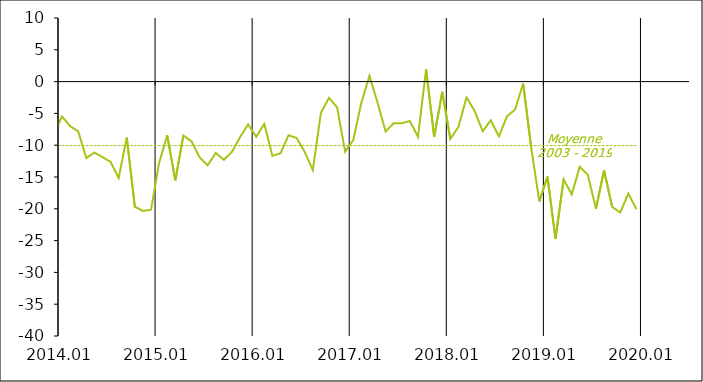
| Category | Series 1 | Moyenne
2003 - 2019 |
|---|---|---|
| 2003-01-20 | 0 | -10.06 |
| 2003-02-20 | -6 | -10.06 |
| 2003-03-20 | -10 | -10.06 |
| 2003-04-20 | 0 | -10.06 |
| 2003-05-20 | -2 | -10.06 |
| 2003-06-20 | -1 | -10.06 |
| 2003-07-20 | -4 | -10.06 |
| 2003-08-20 | 0 | -10.06 |
| 2003-09-20 | -2 | -10.06 |
| 2003-10-20 | -3 | -10.06 |
| 2003-11-20 | 2 | -10.06 |
| 2003-12-20 | -3 | -10.06 |
| 2004-01-20 | -7 | -10.06 |
| 2004-02-20 | -3 | -10.06 |
| 2004-03-20 | 1 | -10.06 |
| 2004-04-20 | -4 | -10.06 |
| 2004-05-20 | -1 | -10.06 |
| 2004-06-20 | -2 | -10.06 |
| 2004-07-20 | -5 | -10.06 |
| 2004-08-20 | 3 | -10.06 |
| 2004-09-20 | -3 | -10.06 |
| 2004-10-20 | 1 | -10.06 |
| 2004-11-20 | -6 | -10.06 |
| 2004-12-20 | -4 | -10.06 |
| 2005-01-20 | -3 | -10.06 |
| 2005-02-20 | 5 | -10.06 |
| 2005-03-20 | -5 | -10.06 |
| 2005-04-20 | -7 | -10.06 |
| 2005-05-20 | -8 | -10.06 |
| 2005-06-20 | -8 | -10.06 |
| 2005-07-20 | -4 | -10.06 |
| 2005-08-20 | -9 | -10.06 |
| 2005-09-20 | -7 | -10.06 |
| 2005-10-20 | -7 | -10.06 |
| 2005-11-20 | -9 | -10.06 |
| 2005-12-20 | -4 | -10.06 |
| 2006-01-20 | 1 | -10.06 |
| 2006-02-20 | -6 | -10.06 |
| 2006-03-20 | -3 | -10.06 |
| 2006-04-20 | -7 | -10.06 |
| 2006-05-20 | -9 | -10.06 |
| 2006-06-20 | -2 | -10.06 |
| 2006-07-20 | -1 | -10.06 |
| 2006-08-20 | -8 | -10.06 |
| 2006-09-20 | -13 | -10.06 |
| 2006-10-20 | -9 | -10.06 |
| 2006-11-20 | -5 | -10.06 |
| 2006-12-20 | -6 | -10.06 |
| 2007-01-20 | -7 | -10.06 |
| 2007-02-20 | -4 | -10.06 |
| 2007-03-20 | -4 | -10.06 |
| 2007-04-20 | -2 | -10.06 |
| 2007-05-20 | -3 | -10.06 |
| 2007-06-20 | -5 | -10.06 |
| 2007-07-20 | -8 | -10.06 |
| 2007-08-20 | -11 | -10.06 |
| 2007-09-20 | -4 | -10.06 |
| 2007-10-20 | -12 | -10.06 |
| 2007-11-20 | -12 | -10.06 |
| 2007-12-20 | -15 | -10.06 |
| 2008-01-20 | -20 | -10.06 |
| 2008-02-20 | -22 | -10.06 |
| 2008-03-20 | -16 | -10.06 |
| 2008-04-20 | -19 | -10.06 |
| 2008-05-20 | -16 | -10.06 |
| 2008-06-20 | -22 | -10.06 |
| 2008-07-20 | -20 | -10.06 |
| 2008-08-20 | -19 | -10.06 |
| 2008-09-20 | -15 | -10.06 |
| 2008-10-20 | -15 | -10.06 |
| 2008-11-20 | -17 | -10.06 |
| 2008-12-20 | -18 | -10.06 |
| 2009-01-20 | -17 | -10.06 |
| 2009-02-20 | -17 | -10.06 |
| 2009-03-20 | -20 | -10.06 |
| 2009-04-20 | -21 | -10.06 |
| 2009-05-20 | -22 | -10.06 |
| 2009-06-20 | -19 | -10.06 |
| 2009-07-20 | -15 | -10.06 |
| 2009-08-20 | -19 | -10.06 |
| 2009-09-20 | -14 | -10.06 |
| 2009-10-20 | -10 | -10.06 |
| 2009-11-20 | -16 | -10.06 |
| 2009-12-20 | -13 | -10.06 |
| 2010-01-20 | -8 | -10.06 |
| 2010-02-20 | -15 | -10.06 |
| 2010-03-20 | -15 | -10.06 |
| 2010-04-20 | -13 | -10.06 |
| 2010-05-20 | -14 | -10.06 |
| 2010-06-20 | -8 | -10.06 |
| 2010-07-20 | -13 | -10.06 |
| 2010-08-20 | -14 | -10.06 |
| 2010-09-20 | -12 | -10.06 |
| 2010-10-20 | -8 | -10.06 |
| 2010-11-20 | -7 | -10.06 |
| 2010-12-20 | -13 | -10.06 |
| 2011-01-20 | -15 | -10.06 |
| 2011-02-20 | -15 | -10.06 |
| 2011-03-20 | -18 | -10.06 |
| 2011-04-20 | -19 | -10.06 |
| 2011-05-20 | -13 | -10.06 |
| 2011-06-20 | -16 | -10.06 |
| 2011-07-20 | -17 | -10.06 |
| 2011-08-20 | -18 | -10.06 |
| 2011-09-20 | -8 | -10.06 |
| 2011-10-20 | -9 | -10.06 |
| 2011-11-20 | -8 | -10.06 |
| 2011-12-20 | -18 | -10.06 |
| 2012-01-20 | -16 | -10.06 |
| 2012-02-20 | -14 | -10.06 |
| 2012-03-20 | -12 | -10.06 |
| 2012-04-20 | -9 | -10.06 |
| 2012-05-20 | -8 | -10.06 |
| 2012-06-20 | -16 | -10.06 |
| 2012-07-20 | -8 | -10.06 |
| 2012-08-20 | -11 | -10.06 |
| 2012-09-20 | -11 | -10.06 |
| 2012-10-20 | -11 | -10.06 |
| 2012-11-20 | -15.069 | -10.06 |
| 2012-12-20 | -14.739 | -10.06 |
| 2013-01-20 | -14.22 | -10.06 |
| 2013-02-20 | -12.452 | -10.06 |
| 2013-03-20 | -11.836 | -10.06 |
| 2013-04-20 | -14.694 | -10.06 |
| 2013-05-20 | -17.673 | -10.06 |
| 2013-06-20 | -17.878 | -10.06 |
| 2013-07-20 | -11.597 | -10.06 |
| 2013-08-20 | -14.286 | -10.06 |
| 2013-09-20 | -7.624 | -10.06 |
| 2013-10-20 | -11.051 | -10.06 |
| 2013-11-20 | -7.118 | -10.06 |
| 2013-12-20 | -8.084 | -10.06 |
| 2014-01-20 | -5.489 | -10.06 |
| 2014-02-20 | -7.001 | -10.06 |
| 2014-03-20 | -7.84 | -10.06 |
| 2014-04-20 | -12.016 | -10.06 |
| 2014-05-20 | -11.157 | -10.06 |
| 2014-06-20 | -11.867 | -10.06 |
| 2014-07-20 | -12.639 | -10.06 |
| 2014-08-20 | -15.156 | -10.06 |
| 2014-09-20 | -8.8 | -10.06 |
| 2014-10-20 | -19.679 | -10.06 |
| 2014-11-20 | -20.338 | -10.06 |
| 2014-12-20 | -20.141 | -10.06 |
| 2015-01-20 | -12.784 | -10.06 |
| 2015-02-20 | -8.455 | -10.06 |
| 2015-03-20 | -15.527 | -10.06 |
| 2015-04-20 | -8.49 | -10.06 |
| 2015-05-20 | -9.381 | -10.06 |
| 2015-06-20 | -11.9 | -10.06 |
| 2015-07-20 | -13.16 | -10.06 |
| 2015-08-20 | -11.222 | -10.06 |
| 2015-09-20 | -12.293 | -10.06 |
| 2015-10-20 | -11.045 | -10.06 |
| 2015-11-20 | -8.736 | -10.06 |
| 2015-12-20 | -6.726 | -10.06 |
| 2016-01-20 | -8.67 | -10.06 |
| 2016-02-20 | -6.653 | -10.06 |
| 2016-03-20 | -11.663 | -10.06 |
| 2016-04-20 | -11.272 | -10.06 |
| 2016-05-20 | -8.432 | -10.06 |
| 2016-06-20 | -8.867 | -10.06 |
| 2016-07-20 | -11.078 | -10.06 |
| 2016-08-20 | -13.917 | -10.06 |
| 2016-09-20 | -4.904 | -10.06 |
| 2016-10-20 | -2.55 | -10.06 |
| 2016-11-20 | -4.062 | -10.06 |
| 2016-12-20 | -11.011 | -10.06 |
| 2017-01-20 | -9.177 | -10.06 |
| 2017-02-20 | -3.307 | -10.06 |
| 2017-03-20 | 0.905 | -10.06 |
| 2017-04-20 | -3.317 | -10.06 |
| 2017-05-20 | -7.84 | -10.06 |
| 2017-06-20 | -6.532 | -10.06 |
| 2017-07-20 | -6.538 | -10.06 |
| 2017-08-20 | -6.198 | -10.06 |
| 2017-09-20 | -8.674 | -10.06 |
| 2017-10-20 | 1.924 | -10.06 |
| 2017-11-20 | -8.669 | -10.06 |
| 2017-12-20 | -1.62 | -10.06 |
| 2018-01-20 | -8.999 | -10.06 |
| 2018-02-20 | -7.121 | -10.06 |
| 2018-03-20 | -2.491 | -10.06 |
| 2018-04-20 | -4.601 | -10.06 |
| 2018-05-20 | -7.808 | -10.06 |
| 2018-06-20 | -6.086 | -10.06 |
| 2018-07-20 | -8.618 | -10.06 |
| 2018-08-20 | -5.47 | -10.06 |
| 2018-09-20 | -4.396 | -10.06 |
| 2018-10-20 | -0.308 | -10.06 |
| 2018-11-20 | -10.44 | -10.06 |
| 2018-12-20 | -18.84 | -10.06 |
| 2019-01-20 | -14.94 | -10.06 |
| 2019-02-20 | -24.71 | -10.06 |
| 2019-03-20 | -15.38 | -10.06 |
| 2019-04-20 | -17.725 | -10.06 |
| 2019-05-20 | -13.39 | -10.06 |
| 2019-06-20 | -14.67 | -10.06 |
| 2019-07-20 | -19.98 | -10.06 |
| 2019-08-20 | -13.95 | -10.06 |
| 2019-09-20 | -19.7 | -10.06 |
| 2019-10-20 | -20.58 | -10.06 |
| 2019-11-20 | -17.6 | -10.06 |
| 2019-12-20 | -20.07 | -10.06 |